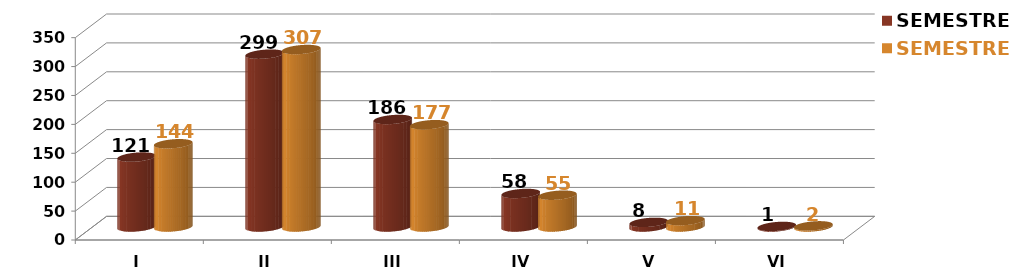
| Category | SEMESTRE I | SEMESTRE II |
|---|---|---|
| I | 121 | 144 |
| II | 299 | 307 |
| III | 186 | 177 |
| IV | 58 | 55 |
| V | 8 | 11 |
| VI | 1 | 2 |